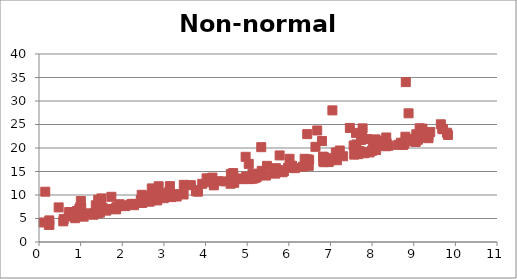
| Category | Y |
|---|---|
| 9.396781977115122 | 23.421 |
| 5.058983942624124 | 13.379 |
| 9.189135496534181 | 22.342 |
| 8.017132052384504 | 20.891 |
| 8.774714518607244 | 20.902 |
| 2.4787782671981287 | 8.299 |
| 4.298734803266225 | 12.941 |
| 1.7218621958597535 | 7.018 |
| 6.917225815455181 | 17.279 |
| 3.7730491001361077 | 10.785 |
| 6.478471427122935 | 16.209 |
| 8.799775930508787 | 22.403 |
| 9.704850704253777 | 23.986 |
| 2.2126631374600016 | 8.015 |
| 7.046811375347177 | 28.003 |
| 5.121359740262226 | 13.649 |
| 6.33989169184823 | 16.025 |
| 2.8390991286691714 | 8.842 |
| 2.867014725591619 | 10.174 |
| 1.0148321956771655 | 7.279 |
| 6.145515226118531 | 15.71 |
| 8.08286543468476 | 21.835 |
| 5.170611227462053 | 13.989 |
| 1.7380932014522898 | 9.617 |
| 5.347374597041491 | 14.337 |
| 3.8162331873213686 | 10.71 |
| 7.871745864260538 | 19.17 |
| 4.0254448240576615 | 13.553 |
| 0.25011552092065403 | 3.693 |
| 3.472496839754702 | 10.11 |
| 8.295073646201395 | 21.47 |
| 4.198649608341984 | 12.05 |
| 1.3116629635241939 | 5.802 |
| 6.442293020973039 | 22.95 |
| 5.339997357892006 | 14.338 |
| 0.8007796327362604 | 5.499 |
| 1.364483193508278 | 7.815 |
| 8.69283399604284 | 21.119 |
| 7.184082159940392 | 18.771 |
| 3.1283397145235092 | 10.694 |
| 9.014608378741066 | 21.915 |
| 9.354636915568953 | 22.083 |
| 6.957484340033141 | 17.003 |
| 2.7087668765612727 | 11.401 |
| 6.98715775153566 | 17.354 |
| 5.037356374486304 | 16.62 |
| 0.15023682829344964 | 10.701 |
| 5.850024557330834 | 14.847 |
| 0.9090621326188708 | 5.489 |
| 7.700296799272161 | 19.351 |
| 5.814656235458325 | 15.291 |
| 4.662268407912194 | 14.669 |
| 6.894228863429009 | 17.373 |
| 6.87507991547702 | 17.602 |
| 7.625030730050684 | 20.749 |
| 6.380190755102514 | 17.699 |
| 5.45128757451001 | 14.14 |
| 4.7853514962066015 | 13.473 |
| 2.58560436767993 | 8.88 |
| 1.8491282192719327 | 6.944 |
| 7.303654708075031 | 18.239 |
| 9.160011341661916 | 22.308 |
| 3.144080025372836 | 11.885 |
| 7.224343693942373 | 19.471 |
| 5.685265199019215 | 14.885 |
| 4.609422137043822 | 14.467 |
| 1.2215159321298308 | 6.098 |
| 7.154214688949523 | 17.396 |
| 0.9898125516233869 | 7.379 |
| 2.067312039963418 | 7.642 |
| 9.315735430949672 | 22.67 |
| 7.6187088642531196 | 18.812 |
| 4.084843240913335 | 12.732 |
| 9.798500233687813 | 23.25 |
| 8.875806118445354 | 27.38 |
| 4.666439594898785 | 13.998 |
| 4.482862538628311 | 12.891 |
| 1.530185617613773 | 7.226 |
| 4.688632664099163 | 12.593 |
| 2.5564519632581186 | 8.714 |
| 3.0997592565857843 | 10.333 |
| 6.842404747287761 | 16.981 |
| 9.062649093540925 | 22.922 |
| 5.674112944218697 | 14.546 |
| 8.350500848611325 | 20.971 |
| 6.976449543667639 | 17.651 |
| 6.075575497765465 | 16.23 |
| 2.070768249363301 | 7.801 |
| 9.0502147387037 | 21.794 |
| 0.9673021608907739 | 7.035 |
| 2.995688292726774 | 9.314 |
| 5.688855172257512 | 15.707 |
| 6.827574923928594 | 17.148 |
| 1.0056173114172495 | 8.715 |
| 6.68191155741355 | 23.727 |
| 0.9083795016157281 | 6.586 |
| 6.795619835136408 | 21.48 |
| 7.038460233193414 | 17.537 |
| 0.5833669628725835 | 4.399 |
| 2.7884588482541437 | 9.315 |
| 9.209512480839795 | 24.126 |
| 9.141407263596667 | 24.194 |
| 0.5931800143103083 | 4.875 |
| 6.639880980998263 | 20.248 |
| 1.464962192485827 | 6.26 |
| 4.962516067629067 | 18.129 |
| 8.744959283419254 | 20.649 |
| 1.8432212147604843 | 7.177 |
| 5.981381701705177 | 15.798 |
| 7.814762795684947 | 18.883 |
| 9.651061505197312 | 25.045 |
| 7.732253050496545 | 21.71 |
| 3.6479157727796654 | 12.095 |
| 6.901148476493914 | 17.828 |
| 4.869059695341699 | 13.483 |
| 2.653276192940753 | 8.571 |
| 9.181877298692271 | 22.201 |
| 8.253830699455305 | 21.318 |
| 6.8221451595843785 | 18.162 |
| 3.7690983117028933 | 10.978 |
| 9.047275891571108 | 21.281 |
| 9.356461611321762 | 22.813 |
| 7.938554908454946 | 19.048 |
| 5.350076849659047 | 15.137 |
| 5.213162581927776 | 13.731 |
| 8.096638195843237 | 19.564 |
| 9.684242954053188 | 24.107 |
| 8.333518386067428 | 20.374 |
| 2.8737554227700945 | 11.859 |
| 4.601513355053938 | 12.393 |
| 7.872798560630656 | 21.917 |
| 9.099344984322538 | 21.751 |
| 2.4665158859499337 | 10.042 |
| 1.336081490673432 | 6.149 |
| 3.2654671556330497 | 9.973 |
| 1.0734928928969645 | 5.395 |
| 6.437910632338571 | 17.58 |
| 3.4770477691977275 | 12.163 |
| 0.7113496748584436 | 5.462 |
| 0.4720504381756718 | 7.362 |
| 8.759733806595566 | 21.102 |
| 5.778956348063524 | 18.42 |
| 3.921282805376695 | 12.378 |
| 6.017205264777735 | 17.703 |
| 1.498768886484878 | 9.279 |
| 5.228315180038835 | 13.833 |
| 3.808797057084401 | 10.896 |
| 1.4208642216649692 | 6.13 |
| 7.466397359768768 | 24.266 |
| 8.628821712689533 | 20.671 |
| 0.8678223628251269 | 5.062 |
| 2.2389952591856876 | 8.12 |
| 2.4447489159045253 | 8.93 |
| 6.488015971735042 | 17.514 |
| 5.475349889369925 | 16.207 |
| 3.3060580191048583 | 9.677 |
| 1.4220802941603572 | 8.981 |
| 3.3112207259986723 | 10.179 |
| 7.772528046709635 | 24.183 |
| 1.934348072182016 | 8.037 |
| 7.570445945044293 | 18.589 |
| 7.557140670240551 | 20.536 |
| 7.998283421828871 | 19.395 |
| 2.9409118180045035 | 10.085 |
| 9.82253495760075 | 22.779 |
| 4.165776164289373 | 13.706 |
| 4.976241229196527 | 13.941 |
| 3.1791641350237554 | 9.546 |
| 2.6335115404529152 | 9.795 |
| 8.339975416649063 | 22.24 |
| 0.24737561700851285 | 4.597 |
| 8.98276170211538 | 21.417 |
| 5.124612921889014 | 13.481 |
| 0.7247319995504298 | 6.379 |
| 5.337747367985013 | 20.179 |
| 1.6180219035900079 | 6.674 |
| 5.217356842176903 | 13.789 |
| 2.856568417636317 | 9.448 |
| 2.706301832921599 | 8.88 |
| 1.49080393916727 | 8.532 |
| 7.129149974529372 | 19.062 |
| 3.8006774077669894 | 10.986 |
| 2.282852776606905 | 7.828 |
| 6.844974668639269 | 18.038 |
| 2.4983312495958696 | 9.042 |
| 8.809429891579754 | 34.022 |
| 0.10887500830131014 | 4.156 |
| 4.8732811476092035 | 13.369 |
| 8.398498939769796 | 20.486 |
| 5.882302841676351 | 15.053 |
| 7.613201551357677 | 23.223 |
| 1.8625195893512214 | 7.431 |
| 7.670152781754588 | 18.69 |
| 8.099030903514986 | 20.389 |
| 5.1274075978276645 | 14.553 |
| 5.1712184194589526 | 13.538 |
| 1.4156206739056043 | 6.924 |
| 0.23762047431612587 | 3.647 |
| 7.754849501372959 | 22.893 |